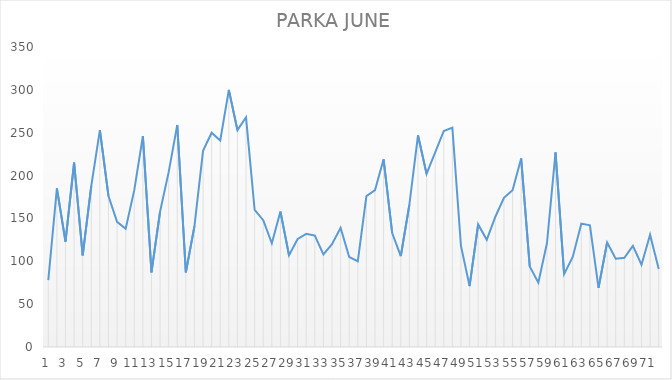
| Category | PARKA JUNE |
|---|---|
| 0 | 78 |
| 1 | 185 |
| 2 | 123 |
| 3 | 215 |
| 4 | 107 |
| 5 | 188 |
| 6 | 253 |
| 7 | 176 |
| 8 | 146 |
| 9 | 138 |
| 10 | 183 |
| 11 | 246 |
| 12 | 87 |
| 13 | 158 |
| 14 | 204 |
| 15 | 259 |
| 16 | 87 |
| 17 | 141 |
| 18 | 229 |
| 19 | 250 |
| 20 | 241 |
| 21 | 300 |
| 22 | 253 |
| 23 | 268 |
| 24 | 160 |
| 25 | 148 |
| 26 | 121 |
| 27 | 158 |
| 28 | 107 |
| 29 | 126 |
| 30 | 132 |
| 31 | 130 |
| 32 | 108 |
| 33 | 120 |
| 34 | 139 |
| 35 | 105 |
| 36 | 100 |
| 37 | 176 |
| 38 | 183 |
| 39 | 219 |
| 40 | 133 |
| 41 | 106 |
| 42 | 166 |
| 43 | 247 |
| 44 | 202 |
| 45 | 227 |
| 46 | 252 |
| 47 | 256 |
| 48 | 118 |
| 49 | 71 |
| 50 | 143 |
| 51 | 125 |
| 52 | 152 |
| 53 | 174 |
| 54 | 183 |
| 55 | 220 |
| 56 | 94 |
| 57 | 75 |
| 58 | 121 |
| 59 | 227 |
| 60 | 85 |
| 61 | 105 |
| 62 | 144 |
| 63 | 142 |
| 64 | 69 |
| 65 | 122 |
| 66 | 103 |
| 67 | 104 |
| 68 | 118 |
| 69 | 96 |
| 70 | 131 |
| 71 | 91 |